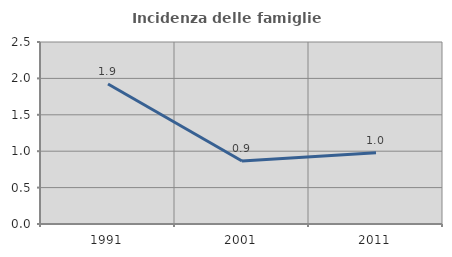
| Category | Incidenza delle famiglie numerose |
|---|---|
| 1991.0 | 1.923 |
| 2001.0 | 0.865 |
| 2011.0 | 0.978 |